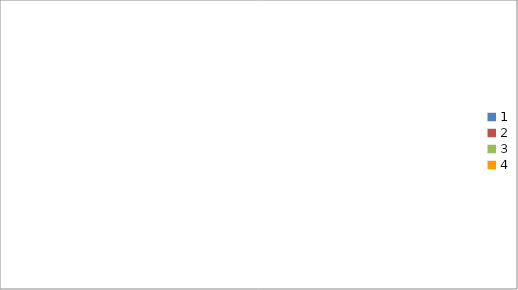
| Category | Series 0 |
|---|---|
| 0 | 3260 |
| 1 | 2310 |
| 2 | 2820 |
| 3 | 810 |